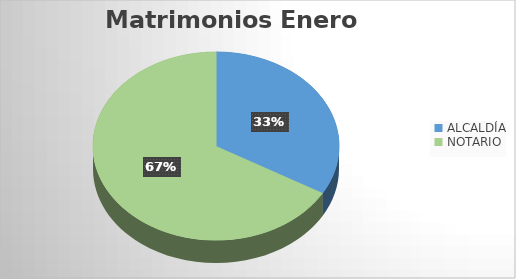
| Category | Matrimonios Enero 2019 |
|---|---|
| ALCALDÍA | 8 |
| NOTARIO | 16 |